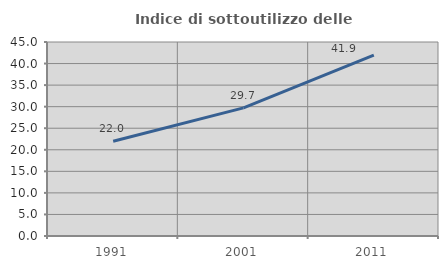
| Category | Indice di sottoutilizzo delle abitazioni  |
|---|---|
| 1991.0 | 21.991 |
| 2001.0 | 29.72 |
| 2011.0 | 41.935 |